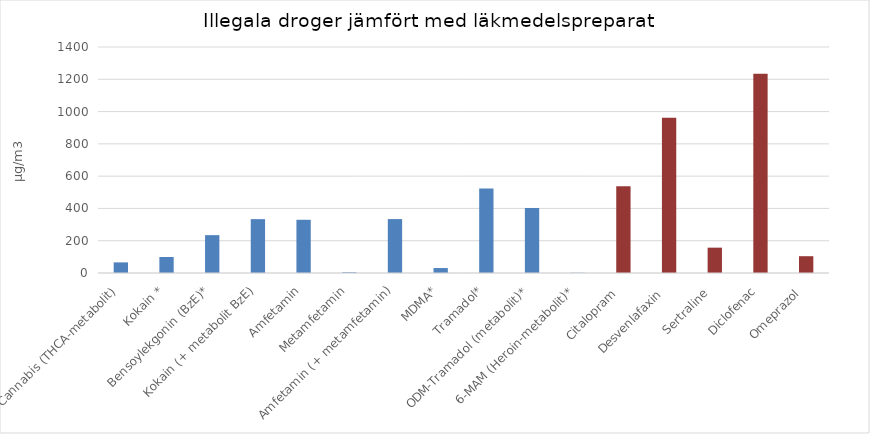
| Category | Illegala droger jämfört med läkmedelsubstanser  |
|---|---|
| Cannabis (THCA-metabolit) | 65.8 |
| Kokain * | 99.2 |
| Bensoylekgonin (BzE)* | 234.467 |
| Kokain (+ metabolit BzE) | 333.633 |
| Amfetamin | 329.633 |
| Metamfetamin | 4.3 |
| Amfetamin (+ metamfetamin) | 333.933 |
| MDMA* | 30.633 |
| Tramadol* | 524.067 |
| ODM-Tramadol (metabolit)* | 402.533 |
| 6-MAM (Heroin-metabolit)* | 1.4 |
| Citalopram  | 537 |
| Desvenlafaxin  | 962 |
| Sertraline  | 157 |
| Diclofenac | 1235 |
| Omeprazol  | 104 |